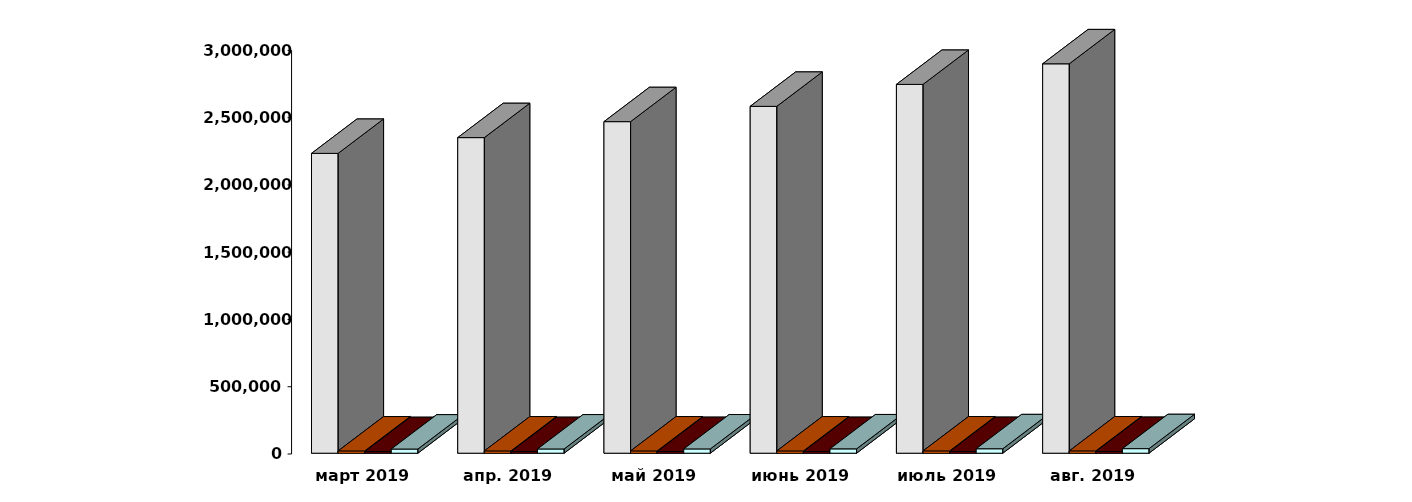
| Category | Физические лица | Юридические лица | Иностранные лица | Клиенты, передавшие свои средства в ДУ |
|---|---|---|---|---|
| 2019-03-30 | 2228680 | 16743 | 11947 | 30898 |
| 2019-04-30 | 2345873 | 16794 | 12185 | 31398 |
| 2019-05-30 | 2464521 | 16758 | 12375 | 31803 |
| 2019-06-30 | 2578398 | 16818 | 12464 | 32273 |
| 2019-07-31 | 2741361 | 16917 | 12726 | 33008 |
| 2019-08-31 | 2894450 | 17007 | 12945 | 33858 |